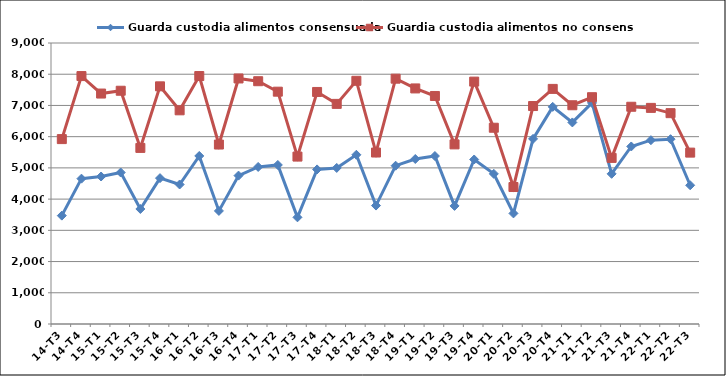
| Category | Guarda custodia alimentos consensuada | Guardia custodia alimentos no consensuada |
|---|---|---|
| 14-T3 | 3471 | 5922 |
| 14-T4 | 4655 | 7941 |
| 15-T1 | 4724 | 7381 |
| 15-T2 | 4852 | 7471 |
| 15-T3 | 3684 | 5640 |
| 15-T4 | 4672 | 7612 |
| 16-T1 | 4468 | 6844 |
| 16-T2 | 5382 | 7942 |
| 16-T3 | 3622 | 5748 |
| 16-T4 | 4753 | 7864 |
| 17-T1 | 5030 | 7776 |
| 17-T2 | 5094 | 7441 |
| 17-T3 | 3417 | 5362 |
| 17-T4 | 4951 | 7432 |
| 18-T1 | 4998 | 7050 |
| 18-T2 | 5420 | 7789 |
| 18-T3 | 3793 | 5492 |
| 18-T4 | 5070 | 7857 |
| 19-T1 | 5285 | 7545 |
| 19-T2 | 5380 | 7303 |
| 19-T3 | 3782 | 5753 |
| 19-T4 | 5269 | 7763 |
| 20-T1 | 4809 | 6286 |
| 20-T2 | 3542 | 4387 |
| 20-T3 | 5930 | 6981 |
| 20-T4 | 6955 | 7530 |
| 21-T1 | 6456 | 7006 |
| 21-T2 | 7080 | 7264 |
| 21-T3 | 4810 | 5320 |
| 21-T4 | 5686 | 6958 |
| 22-T1 | 5888 | 6922 |
| 22-T2 | 5919 | 6753 |
| 22-T3 | 4443 | 5489 |